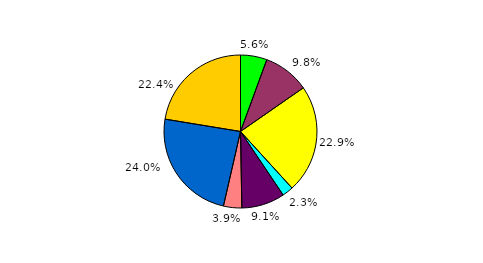
| Category | Series 0 |
|---|---|
| 0 | 5.589 |
| 1 | 9.743 |
| 2 | 22.91 |
| 3 | 2.342 |
| 4 | 9.135 |
| 5 | 3.866 |
| 6 | 24.003 |
| 7 | 22.412 |